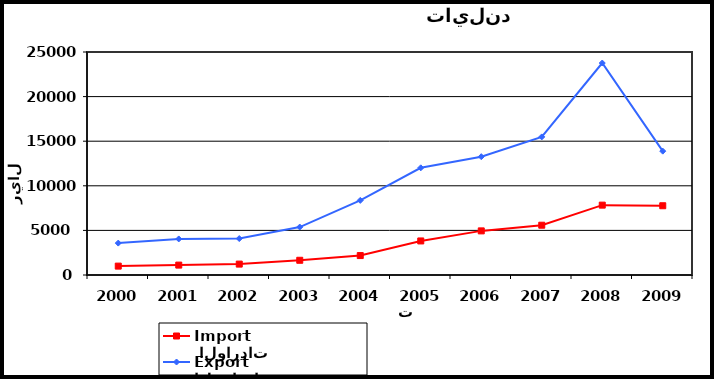
| Category |  الواردات           Import | الصادرات          Export |
|---|---|---|
| 2000.0 | 996 | 3578 |
| 2001.0 | 1110 | 4042 |
| 2002.0 | 1222 | 4085 |
| 2003.0 | 1651 | 5376 |
| 2004.0 | 2179 | 8365 |
| 2005.0 | 3817 | 12016 |
| 2006.0 | 4946 | 13264 |
| 2007.0 | 5582 | 15480 |
| 2008.0 | 7832 | 23765 |
| 2009.0 | 7764 | 13884 |